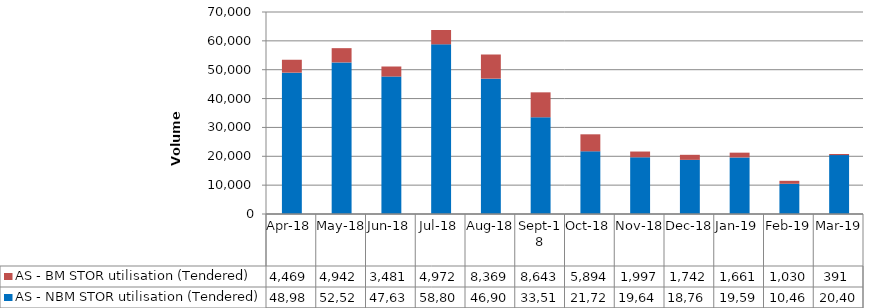
| Category | AS - NBM STOR utilisation (Tendered) | AS - BM STOR utilisation (Tendered) |
|---|---|---|
| 2018-04-30 | 48983.042 | 4468.876 |
| 2018-05-31 | 52527.169 | 4942.208 |
| 2018-06-30 | 47632.441 | 3480.5 |
| 2018-07-31 | 58800.014 | 4972.251 |
| 2018-08-31 | 46902.69 | 8369.082 |
| 2018-09-30 | 33517.139 | 8642.942 |
| 2018-10-31 | 21720.93 | 5893.742 |
| 2018-11-30 | 19648.59 | 1997.292 |
| 2018-12-31 | 18769.13 | 1741.749 |
| 2019-01-31 | 19595.663 | 1660.866 |
| 2019-02-28 | 10468.824 | 1029.999 |
| 2019-03-31 | 20403.503 | 391 |